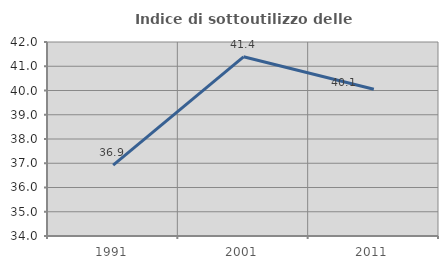
| Category | Indice di sottoutilizzo delle abitazioni  |
|---|---|
| 1991.0 | 36.923 |
| 2001.0 | 41.39 |
| 2011.0 | 40.054 |